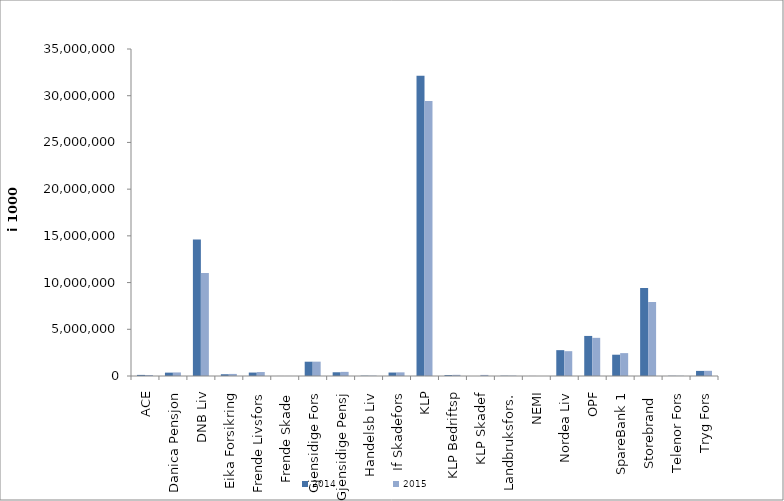
| Category | 2014 | 2015 |
|---|---|---|
| ACE | 117183.949 | 107796.071 |
| Danica Pensjon | 360420.339 | 380538.268 |
| DNB Liv | 14620644 | 11032332 |
| Eika Forsikring | 187363 | 222483 |
| Frende Livsfors | 367901 | 422198 |
| Frende Skade | 3474 | 3484 |
| Gjensidige Fors | 1529370 | 1534905 |
| Gjensidige Pensj | 399732.971 | 442159 |
| Handelsb Liv | 34956 | 40133 |
| If Skadefors | 370746.998 | 390668.432 |
| KLP | 32144659.606 | 29434379.388 |
| KLP Bedriftsp | 99624 | 123611 |
| KLP Skadef | 0 | 115950 |
| Landbruksfors. | 30845 | 39880 |
| NEMI | 4717 | 2346 |
| Nordea Liv | 2766992 | 2657396.205 |
| OPF | 4288471 | 4084610 |
| SpareBank 1 | 2278499.525 | 2449137.974 |
| Storebrand  | 9429042.203 | 7918141.52 |
| Telenor Fors | 23184 | 24710 |
| Tryg Fors | 545559.61 | 555281.852 |